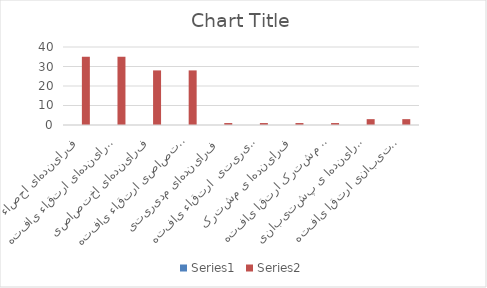
| Category | Series 0 | Series 1 |
|---|---|---|
| فرایندهای احصاء شده |  | 35 |
| فرایندهای ارتقاء یافته |  | 35 |
| فرایندهای اختصاصی |  | 28 |
| فرایندهای اختصاصی ارتقاء یافته |  | 28 |
| فرایندهای مدیریتی |  | 1 |
| فرایندهای مدیریتی  ارتقاء یافته |  | 1 |
| فرایندها ی مشترک |  | 1 |
| فرایندها ی مشترک ارتقا یافته |  | 1 |
| فرایندها ی پشتیبانی |  | 3 |
| فرایندها ی پشتیبانی ارتقا یافته |  | 3 |